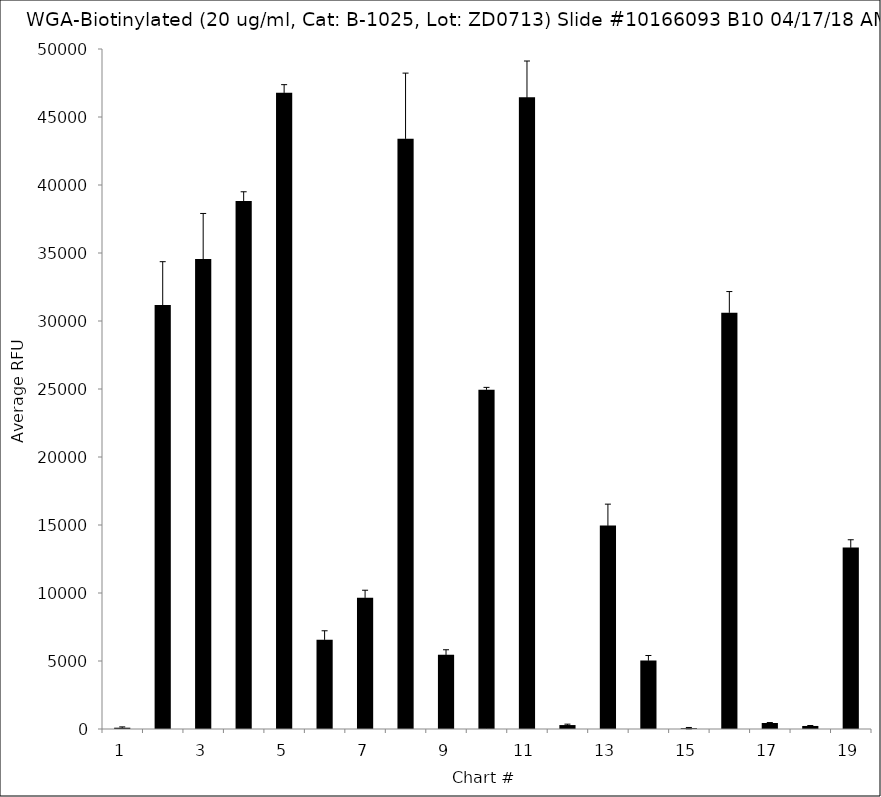
| Category | Series 0 |
|---|---|
| 1.0 | 95.25 |
| 2.0 | 31169.25 |
| 3.0 | 34549.75 |
| 4.0 | 38828.25 |
| 5.0 | 46777.75 |
| 6.0 | 6557.5 |
| 7.0 | 9645.5 |
| 8.0 | 43393 |
| 9.0 | 5451 |
| 10.0 | 24947.25 |
| 11.0 | 46451.75 |
| 12.0 | 290 |
| 13.0 | 14954.25 |
| 14.0 | 5031.5 |
| 15.0 | 60.75 |
| 16.0 | 30610 |
| 17.0 | 442 |
| 18.0 | 223 |
| 19.0 | 13342.25 |